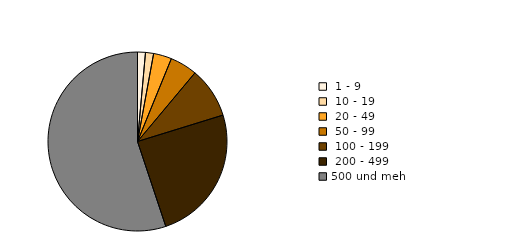
| Category | Series 0 |
|---|---|
|  1 - 9 | 6399 |
|  10 - 19 | 6554 |
|  20 - 49 | 14725 |
|  50 - 99 | 22038 |
|  100 - 199 | 40984 |
|  200 - 499 | 110508 |
| 500 und mehr | 247101 |